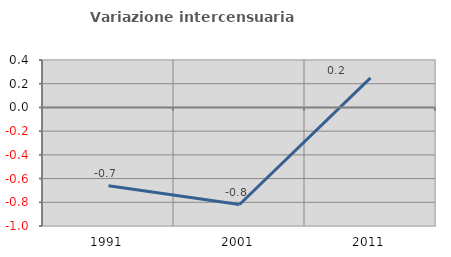
| Category | Variazione intercensuaria annua |
|---|---|
| 1991.0 | -0.66 |
| 2001.0 | -0.819 |
| 2011.0 | 0.249 |